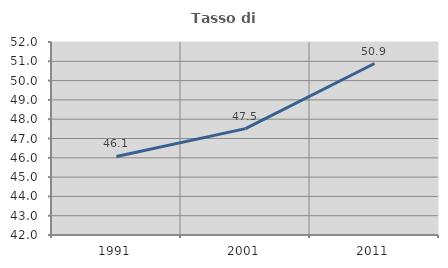
| Category | Tasso di occupazione   |
|---|---|
| 1991.0 | 46.069 |
| 2001.0 | 47.512 |
| 2011.0 | 50.884 |